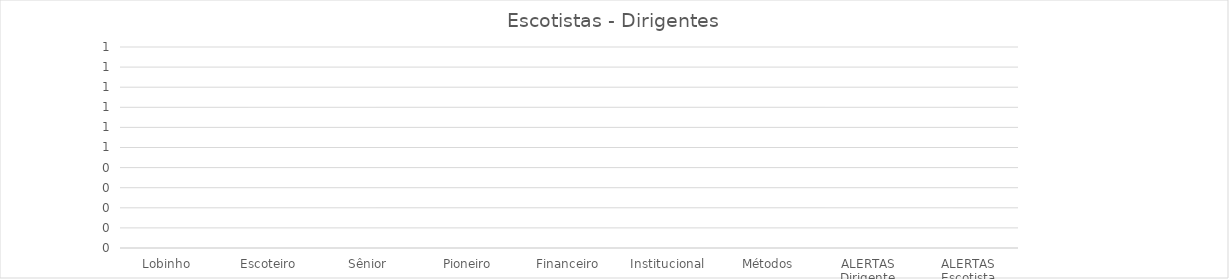
| Category | Pontos |
|---|---|
| Lobinho  | 0 |
| Escoteiro | 0 |
| Sênior | 0 |
| Pioneiro | 0 |
| Financeiro | 0 |
| Institucional | 0 |
| Métodos | 0 |
| ALERTAS Dirigente | 0 |
| ALERTAS Escotista | 0 |